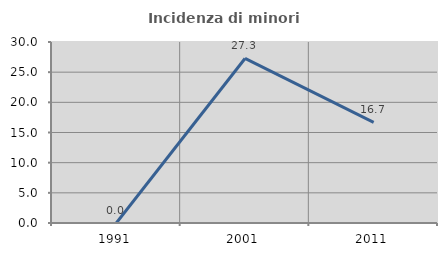
| Category | Incidenza di minori stranieri |
|---|---|
| 1991.0 | 0 |
| 2001.0 | 27.273 |
| 2011.0 | 16.667 |